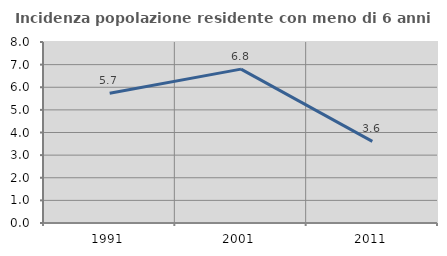
| Category | Incidenza popolazione residente con meno di 6 anni |
|---|---|
| 1991.0 | 5.731 |
| 2001.0 | 6.801 |
| 2011.0 | 3.609 |